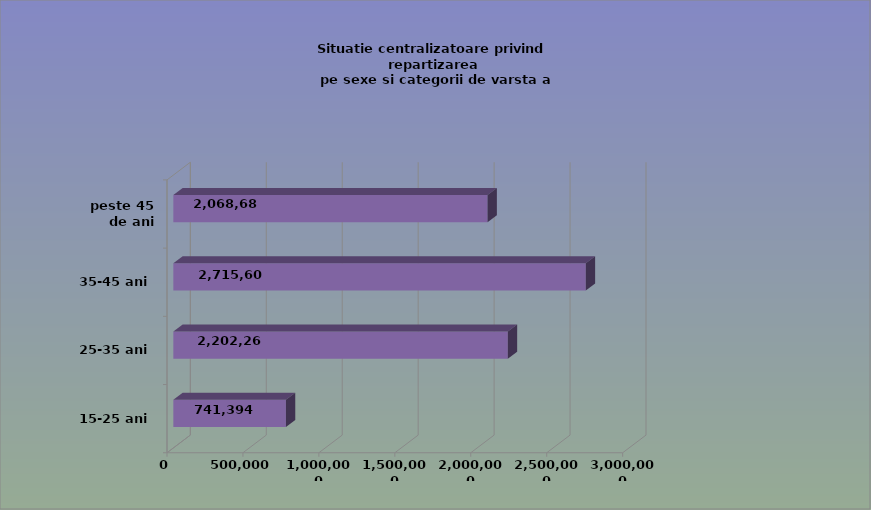
| Category | 15-25 ani 25-35 ani 35-45 ani peste 45 de ani |
|---|---|
| 15-25 ani | 741394 |
| 25-35 ani | 2202264 |
| 35-45 ani | 2715603 |
| peste 45 de ani | 2068687 |